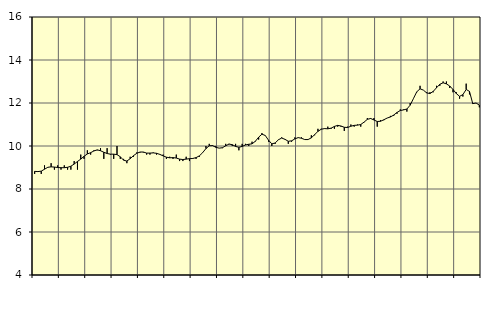
| Category | Piggar | Utbildning, SNI 85 |
|---|---|---|
| nan | 8.7 | 8.82 |
| 87.0 | 8.8 | 8.81 |
| 87.0 | 8.7 | 8.83 |
| 87.0 | 9.1 | 8.92 |
| nan | 9 | 9.01 |
| 88.0 | 9.2 | 9.03 |
| 88.0 | 8.9 | 9.02 |
| 88.0 | 9.1 | 9 |
| nan | 8.9 | 8.99 |
| 89.0 | 9.1 | 8.99 |
| 89.0 | 8.9 | 9.01 |
| 89.0 | 8.9 | 9.06 |
| nan | 9.3 | 9.16 |
| 90.0 | 8.9 | 9.28 |
| 90.0 | 9.6 | 9.39 |
| 90.0 | 9.4 | 9.52 |
| nan | 9.8 | 9.63 |
| 91.0 | 9.6 | 9.69 |
| 91.0 | 9.8 | 9.77 |
| 91.0 | 9.8 | 9.82 |
| nan | 9.9 | 9.78 |
| 92.0 | 9.4 | 9.71 |
| 92.0 | 9.9 | 9.65 |
| 92.0 | 9.6 | 9.62 |
| nan | 9.4 | 9.62 |
| 93.0 | 10 | 9.6 |
| 93.0 | 9.4 | 9.5 |
| 93.0 | 9.4 | 9.34 |
| nan | 9.2 | 9.3 |
| 94.0 | 9.5 | 9.41 |
| 94.0 | 9.5 | 9.55 |
| 94.0 | 9.7 | 9.66 |
| nan | 9.7 | 9.72 |
| 95.0 | 9.7 | 9.72 |
| 95.0 | 9.6 | 9.67 |
| 95.0 | 9.6 | 9.67 |
| nan | 9.7 | 9.68 |
| 96.0 | 9.6 | 9.66 |
| 96.0 | 9.6 | 9.61 |
| 96.0 | 9.6 | 9.54 |
| nan | 9.4 | 9.48 |
| 97.0 | 9.5 | 9.45 |
| 97.0 | 9.4 | 9.46 |
| 97.0 | 9.6 | 9.44 |
| nan | 9.3 | 9.39 |
| 98.0 | 9.3 | 9.37 |
| 98.0 | 9.5 | 9.39 |
| 98.0 | 9.3 | 9.41 |
| nan | 9.4 | 9.42 |
| 99.0 | 9.4 | 9.46 |
| 99.0 | 9.5 | 9.54 |
| 99.0 | 9.7 | 9.69 |
| nan | 10 | 9.88 |
| 0.0 | 10.1 | 10.01 |
| 0.0 | 10 | 10.02 |
| 0.0 | 10 | 9.94 |
| nan | 9.9 | 9.9 |
| 1.0 | 9.9 | 9.92 |
| 1.0 | 10.1 | 10.01 |
| 1.0 | 10.1 | 10.09 |
| nan | 10 | 10.06 |
| 2.0 | 10.1 | 9.98 |
| 2.0 | 9.8 | 9.94 |
| 2.0 | 10.1 | 9.98 |
| nan | 10.1 | 10.05 |
| 3.0 | 10 | 10.08 |
| 3.0 | 10.2 | 10.1 |
| 3.0 | 10.2 | 10.22 |
| nan | 10.3 | 10.41 |
| 4.0 | 10.6 | 10.55 |
| 4.0 | 10.5 | 10.49 |
| 4.0 | 10.2 | 10.27 |
| nan | 10 | 10.1 |
| 5.0 | 10.1 | 10.14 |
| 5.0 | 10.3 | 10.29 |
| 5.0 | 10.4 | 10.37 |
| nan | 10.3 | 10.31 |
| 6.0 | 10.1 | 10.22 |
| 6.0 | 10.2 | 10.24 |
| 6.0 | 10.4 | 10.33 |
| nan | 10.4 | 10.39 |
| 7.0 | 10.4 | 10.36 |
| 7.0 | 10.3 | 10.3 |
| 7.0 | 10.3 | 10.3 |
| nan | 10.5 | 10.38 |
| 8.0 | 10.5 | 10.53 |
| 8.0 | 10.8 | 10.68 |
| 8.0 | 10.8 | 10.78 |
| nan | 10.8 | 10.81 |
| 9.0 | 10.9 | 10.8 |
| 9.0 | 10.8 | 10.83 |
| 9.0 | 10.8 | 10.91 |
| nan | 10.9 | 10.96 |
| 10.0 | 10.9 | 10.93 |
| 10.0 | 10.7 | 10.87 |
| 10.0 | 10.9 | 10.86 |
| nan | 11 | 10.92 |
| 11.0 | 10.9 | 10.96 |
| 11.0 | 11 | 10.97 |
| 11.0 | 10.9 | 11 |
| nan | 11.1 | 11.11 |
| 12.0 | 11.3 | 11.24 |
| 12.0 | 11.3 | 11.28 |
| 12.0 | 11.3 | 11.21 |
| nan | 10.9 | 11.14 |
| 13.0 | 11.2 | 11.15 |
| 13.0 | 11.2 | 11.22 |
| 13.0 | 11.3 | 11.3 |
| nan | 11.4 | 11.35 |
| 14.0 | 11.4 | 11.44 |
| 14.0 | 11.5 | 11.56 |
| 14.0 | 11.7 | 11.65 |
| nan | 11.7 | 11.68 |
| 15.0 | 11.6 | 11.72 |
| 15.0 | 12 | 11.9 |
| 15.0 | 12.2 | 12.21 |
| nan | 12.5 | 12.52 |
| 16.0 | 12.8 | 12.66 |
| 16.0 | 12.6 | 12.6 |
| 16.0 | 12.5 | 12.47 |
| nan | 12.5 | 12.44 |
| 17.0 | 12.5 | 12.54 |
| 17.0 | 12.8 | 12.71 |
| 17.0 | 12.8 | 12.87 |
| nan | 13 | 12.94 |
| 18.0 | 13 | 12.89 |
| 18.0 | 12.7 | 12.79 |
| 18.0 | 12.5 | 12.63 |
| nan | 12.5 | 12.44 |
| 19.0 | 12.2 | 12.31 |
| 19.0 | 12.3 | 12.39 |
| 19.0 | 12.9 | 12.63 |
| nan | 12.4 | 12.54 |
| 20.0 | 12 | 11.97 |
| 20.0 | 12 | 12 |
| 20.0 | 11.8 | 11.9 |